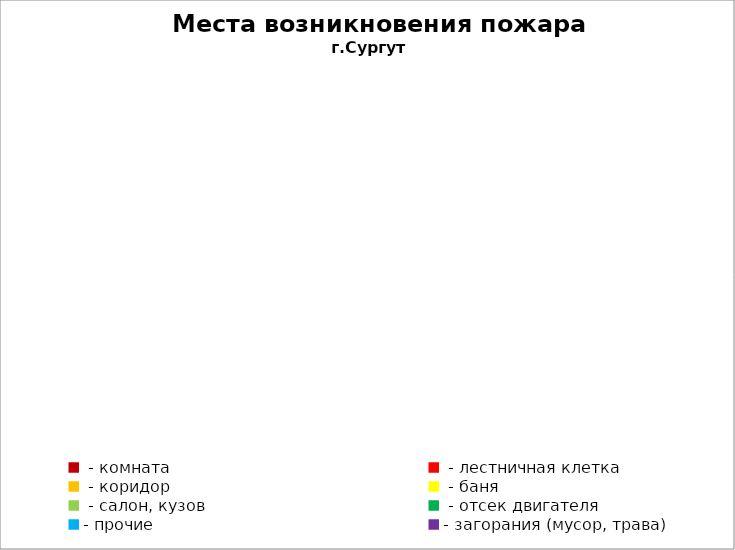
| Category | Места возникновения пожара |
|---|---|
|  - комната | 64 |
|  - лестничная клетка | 9 |
|  - коридор | 6 |
|  - баня | 31 |
|  - салон, кузов | 13 |
|  - отсек двигателя | 37 |
| - прочие | 105 |
| - загорания (мусор, трава)  | 40 |